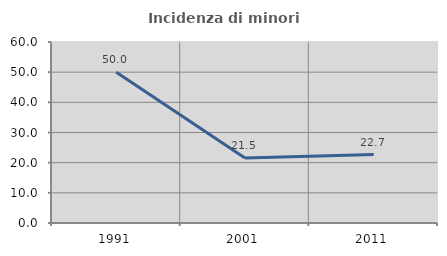
| Category | Incidenza di minori stranieri |
|---|---|
| 1991.0 | 50 |
| 2001.0 | 21.538 |
| 2011.0 | 22.695 |